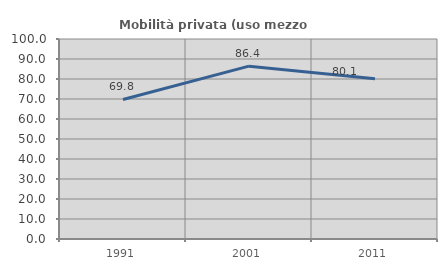
| Category | Mobilità privata (uso mezzo privato) |
|---|---|
| 1991.0 | 69.767 |
| 2001.0 | 86.42 |
| 2011.0 | 80.097 |